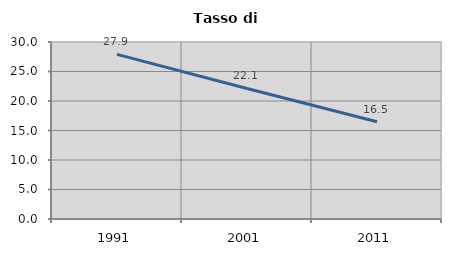
| Category | Tasso di disoccupazione   |
|---|---|
| 1991.0 | 27.907 |
| 2001.0 | 22.124 |
| 2011.0 | 16.475 |